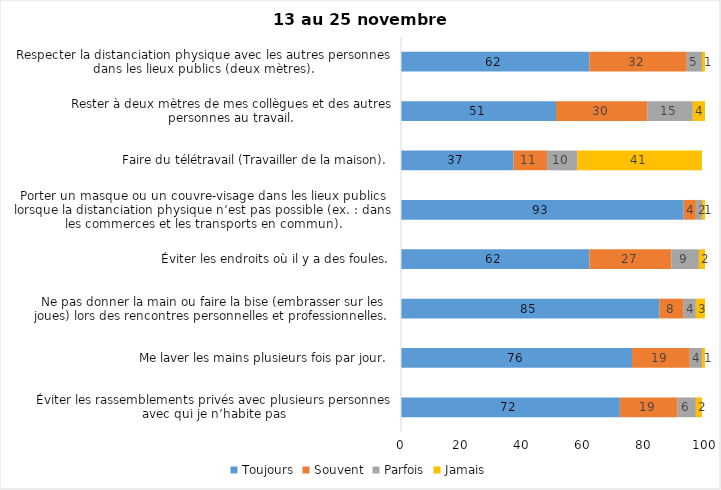
| Category | Toujours | Souvent | Parfois | Jamais |
|---|---|---|---|---|
| Éviter les rassemblements privés avec plusieurs personnes avec qui je n’habite pas | 72 | 19 | 6 | 2 |
| Me laver les mains plusieurs fois par jour. | 76 | 19 | 4 | 1 |
| Ne pas donner la main ou faire la bise (embrasser sur les joues) lors des rencontres personnelles et professionnelles. | 85 | 8 | 4 | 3 |
| Éviter les endroits où il y a des foules. | 62 | 27 | 9 | 2 |
| Porter un masque ou un couvre-visage dans les lieux publics lorsque la distanciation physique n’est pas possible (ex. : dans les commerces et les transports en commun). | 93 | 4 | 2 | 1 |
| Faire du télétravail (Travailler de la maison). | 37 | 11 | 10 | 41 |
| Rester à deux mètres de mes collègues et des autres personnes au travail. | 51 | 30 | 15 | 4 |
| Respecter la distanciation physique avec les autres personnes dans les lieux publics (deux mètres). | 62 | 32 | 5 | 1 |